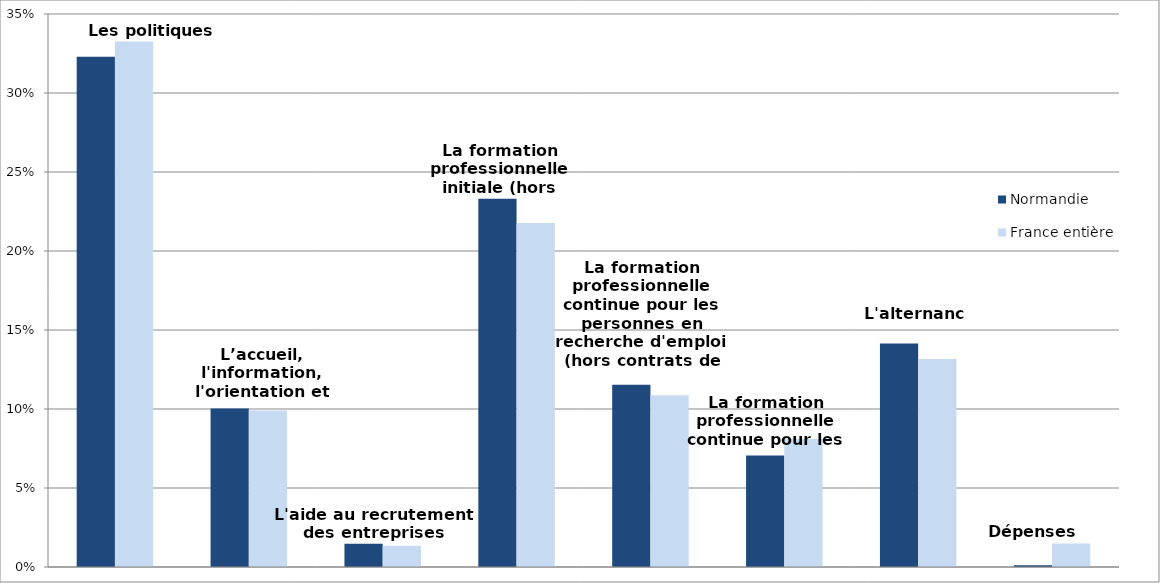
| Category | Normandie | France entière |
|---|---|---|
| Les politiques d'emploi | 0.323 | 0.333 |
| L’accueil, l'information, l'orientation et l'accompagnement | 0.1 | 0.099 |
| L'aide au recrutement des entreprises | 0.015 | 0.013 |
| La formation professionnelle initiale (hors apprentissage) | 0.233 | 0.218 |
| La formation professionnelle continue pour les personnes en recherche d'emploi (hors contrats de professionnalisation) | 0.115 | 0.109 |
| La formation professionnelle continue pour les actifs occupés | 0.071 | 0.081 |
| L'alternance | 0.142 | 0.132 |
| Dépenses non-ventilables | 0.001 | 0.015 |